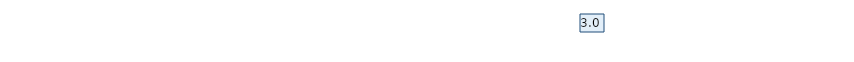
| Category | Итоговая оценка |
|---|---|
| Вопрос 2 | 3 |